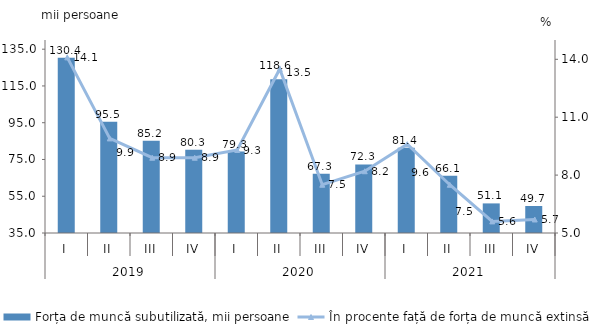
| Category | Forța de muncă subutilizată, mii persoane |
|---|---|
| 0 | 130.4 |
| 1 | 95.5 |
| 2 | 85.2 |
| 3 | 80.3 |
| 4 | 79.3 |
| 5 | 118.6 |
| 6 | 67.3 |
| 7 | 72.3 |
| 8 | 81.4 |
| 9 | 66.1 |
| 10 | 51.1 |
| 11 | 49.7 |